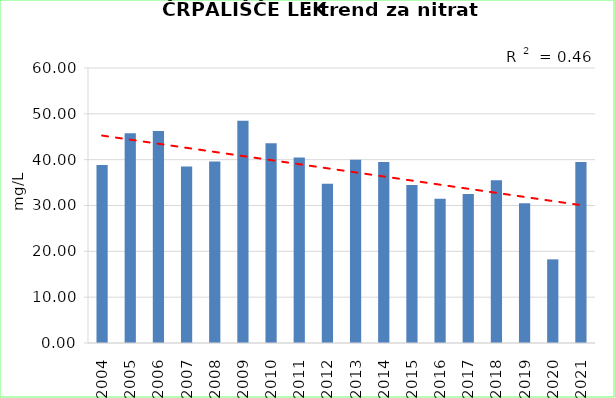
| Category | Vsota |
|---|---|
| 2004 | 38.833 |
| 2005 | 45.767 |
| 2006 | 46.25 |
| 2007 | 38.5 |
| 2008 | 39.6 |
| 2009 | 48.5 |
| 2010 | 43.6 |
| 2011 | 40.5 |
| 2012 | 34.75 |
| 2013 | 40 |
| 2014 | 39.5 |
| 2015 | 34.5 |
| 2016 | 31.5 |
| 2017 | 32.5 |
| 2018 | 35.5 |
| 2019 | 30.5 |
| 2020 | 18.25 |
| 2021 | 39.5 |